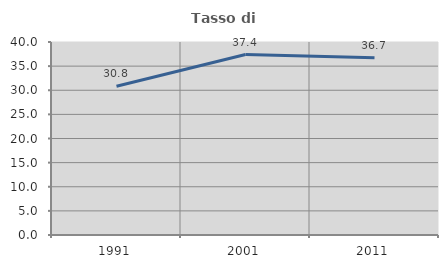
| Category | Tasso di occupazione   |
|---|---|
| 1991.0 | 30.839 |
| 2001.0 | 37.409 |
| 2011.0 | 36.745 |